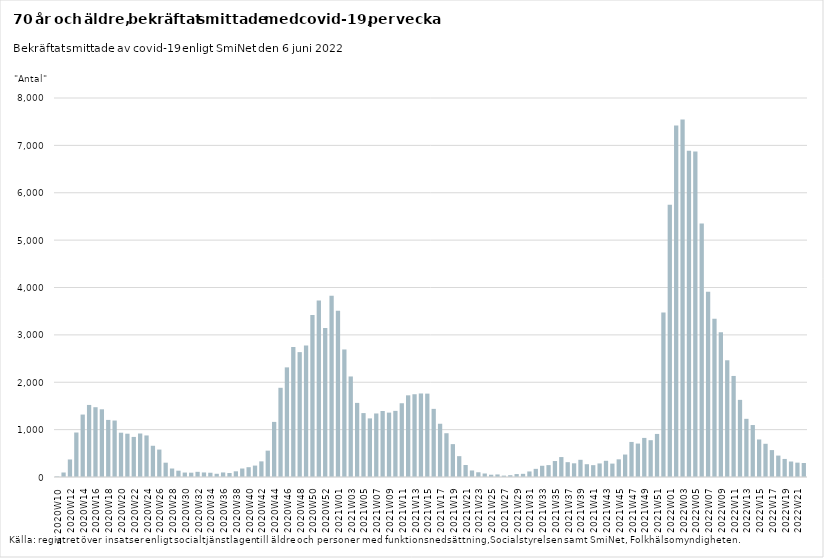
| Category | Series 0 |
|---|---|
| ≤ 2020W10 | 12 |
| 2020W11 | 95 |
| 2020W12 | 370 |
| 2020W13 | 939 |
| 2020W14 | 1318 |
| 2020W15 | 1521 |
| 2020W16 | 1473 |
| 2020W17 | 1429 |
| 2020W18 | 1205 |
| 2020W19 | 1192 |
| 2020W20 | 935 |
| 2020W21 | 914 |
| 2020W22 | 846 |
| 2020W23 | 918 |
| 2020W24 | 877 |
| 2020W25 | 659 |
| 2020W26 | 579 |
| 2020W27 | 302 |
| 2020W28 | 179 |
| 2020W29 | 133 |
| 2020W30 | 94 |
| 2020W31 | 91 |
| 2020W32 | 109 |
| 2020W33 | 96 |
| 2020W34 | 90 |
| 2020W35 | 68 |
| 2020W36 | 96 |
| 2020W37 | 85 |
| 2020W38 | 120 |
| 2020W39 | 179 |
| 2020W40 | 207 |
| 2020W41 | 241 |
| 2020W42 | 330 |
| 2020W43 | 556 |
| 2020W44 | 1163 |
| 2020W45 | 1883 |
| 2020W46 | 2314 |
| 2020W47 | 2742 |
| 2020W48 | 2636 |
| 2020W49 | 2776 |
| 2020W50 | 3418 |
| 2020W51 | 3728 |
| 2020W52 | 3143 |
| 2020W53 | 3824 |
| 2021W01 | 3511 |
| 2021W02 | 2692 |
| 2021W03 | 2122 |
| 2021W04 | 1564 |
| 2021W05 | 1349 |
| 2021W06 | 1237 |
| 2021W07 | 1341 |
| 2021W08 | 1393 |
| 2021W09 | 1359 |
| 2021W10 | 1396 |
| 2021W11 | 1557 |
| 2021W12 | 1724 |
| 2021W13 | 1747 |
| 2021W14 | 1763 |
| 2021W15 | 1760 |
| 2021W16 | 1438 |
| 2021W17 | 1124 |
| 2021W18 | 924 |
| 2021W19 | 694 |
| 2021W20 | 440 |
| 2021W21 | 253 |
| 2021W22 | 138 |
| 2021W23 | 100 |
| 2021W24 | 74 |
| 2021W25 | 48 |
| 2021W26 | 54 |
| 2021W27 | 29 |
| 2021W28 | 38 |
| 2021W29 | 62 |
| 2021W30 | 67 |
| 2021W31 | 117 |
| 2021W32 | 172 |
| 2021W33 | 237 |
| 2021W34 | 251 |
| 2021W35 | 337 |
| 2021W36 | 421 |
| 2021W37 | 313 |
| 2021W38 | 289 |
| 2021W39 | 363 |
| 2021W40 | 270 |
| 2021W41 | 250 |
| 2021W42 | 286 |
| 2021W43 | 342 |
| 2021W44 | 283 |
| 2021W45 | 373 |
| 2021W46 | 474 |
| 2021W47 | 740 |
| 2021W48 | 706 |
| 2021W49 | 825 |
| 2021W50 | 777 |
| 2021W51 | 909 |
| 2021W52 | 3472 |
| 2022W01 | 5747 |
| 2022W02 | 7417 |
| 2022W03 | 7548 |
| 2022W04 | 6888 |
| 2022W05 | 6873 |
| 2022W06 | 5351 |
| 2022W07 | 3912 |
| 2022W08 | 3342 |
| 2022W09 | 3057 |
| 2022W10 | 2464 |
| 2022W11 | 2133 |
| 2022W12 | 1628 |
| 2022W13 | 1228 |
| 2022W14 | 1097 |
| 2022W15 | 792 |
| 2022W16 | 701 |
| 2022W17 | 568 |
| 2022W18 | 452 |
| 2022W19 | 381 |
| 2022W20 | 327 |
| 2022W21 | 303 |
| 2022W22 | 295 |